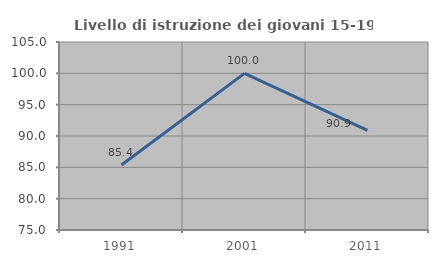
| Category | Livello di istruzione dei giovani 15-19 anni |
|---|---|
| 1991.0 | 85.366 |
| 2001.0 | 100 |
| 2011.0 | 90.909 |